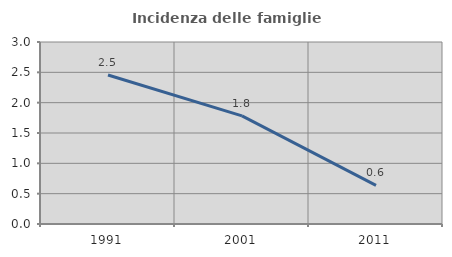
| Category | Incidenza delle famiglie numerose |
|---|---|
| 1991.0 | 2.457 |
| 2001.0 | 1.783 |
| 2011.0 | 0.638 |